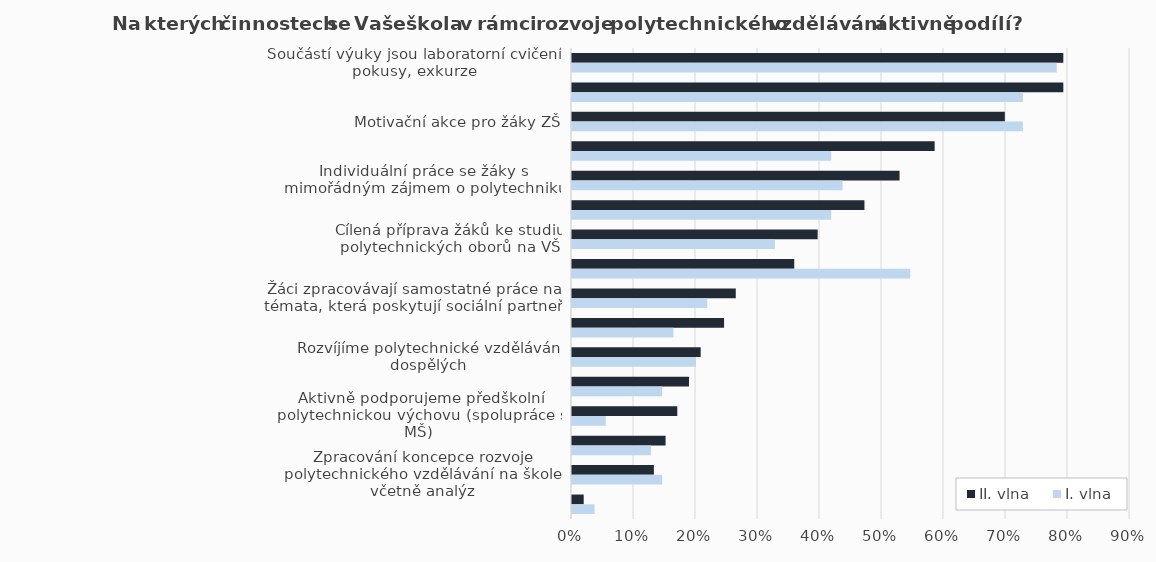
| Category | II. vlna | I. vlna |
|---|---|---|
| Součástí výuky jsou laboratorní cvičení, pokusy, exkurze | 0.792 | 0.782 |
| Zapojení žáků do soutěží/olympiád apod | 0.792 | 0.727 |
| Motivační akce pro žáky ZŠ | 0.698 | 0.727 |
| Spolupráce se ZŠ – využití laboratoří, dílen, mediálních laboratoří | 0.585 | 0.418 |
| Individuální práce se žáky s mimořádným zájmem o polytechniku | 0.528 | 0.436 |
| Spolupráce s VŠ, výzkumnými pracovišti technického zaměření | 0.472 | 0.418 |
| Cílená příprava žáků ke studiu polytechnických oborů na VŠ | 0.396 | 0.327 |
| Příprava výukových materiálů pro výuku polytechnického charakteru | 0.358 | 0.545 |
| Žáci zpracovávají samostatné práce na témata, která poskytují sociální partneři | 0.264 | 0.218 |
| Zapojení žáků do nepovinných předmětů polytechnického zaměření | 0.245 | 0.164 |
| Rozvíjíme polytechnické vzdělávání dospělých | 0.208 | 0.2 |
| Zpracování provázaného plánu výuky polytechnických předmětů a matematiky | 0.189 | 0.145 |
| Aktivně podporujeme předškolní polytechnickou výchovu (spolupráce s MŠ) | 0.17 | 0.055 |
| Výuka vybraných témat polytechnických předmětů v cizích jazycích | 0.151 | 0.127 |
| Zpracování koncepce rozvoje polytechnického vzdělávání na škole, včetně analýz | 0.132 | 0.145 |
| Jiné | 0.019 | 0.036 |